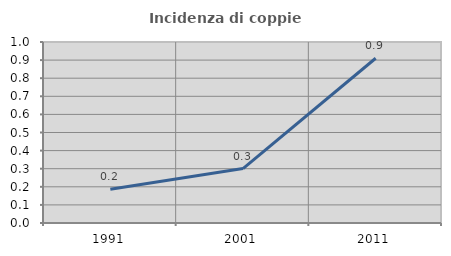
| Category | Incidenza di coppie miste |
|---|---|
| 1991.0 | 0.186 |
| 2001.0 | 0.301 |
| 2011.0 | 0.91 |